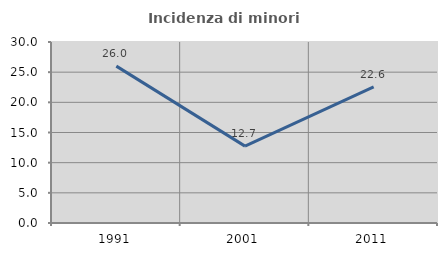
| Category | Incidenza di minori stranieri |
|---|---|
| 1991.0 | 26 |
| 2001.0 | 12.741 |
| 2011.0 | 22.576 |